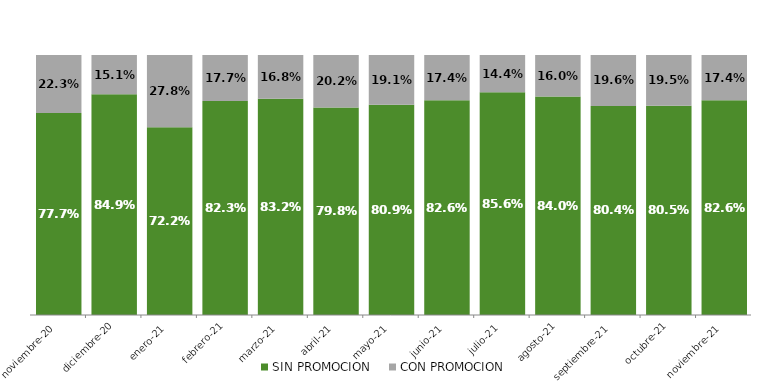
| Category | SIN PROMOCION   | CON PROMOCION   |
|---|---|---|
| 2020-11-01 | 0.777 | 0.223 |
| 2020-12-01 | 0.849 | 0.151 |
| 2021-01-01 | 0.722 | 0.278 |
| 2021-02-01 | 0.823 | 0.177 |
| 2021-03-01 | 0.832 | 0.168 |
| 2021-04-01 | 0.798 | 0.202 |
| 2021-05-01 | 0.809 | 0.191 |
| 2021-06-01 | 0.826 | 0.174 |
| 2021-07-01 | 0.856 | 0.144 |
| 2021-08-01 | 0.84 | 0.16 |
| 2021-09-01 | 0.804 | 0.196 |
| 2021-10-01 | 0.805 | 0.195 |
| 2021-11-01 | 0.826 | 0.174 |